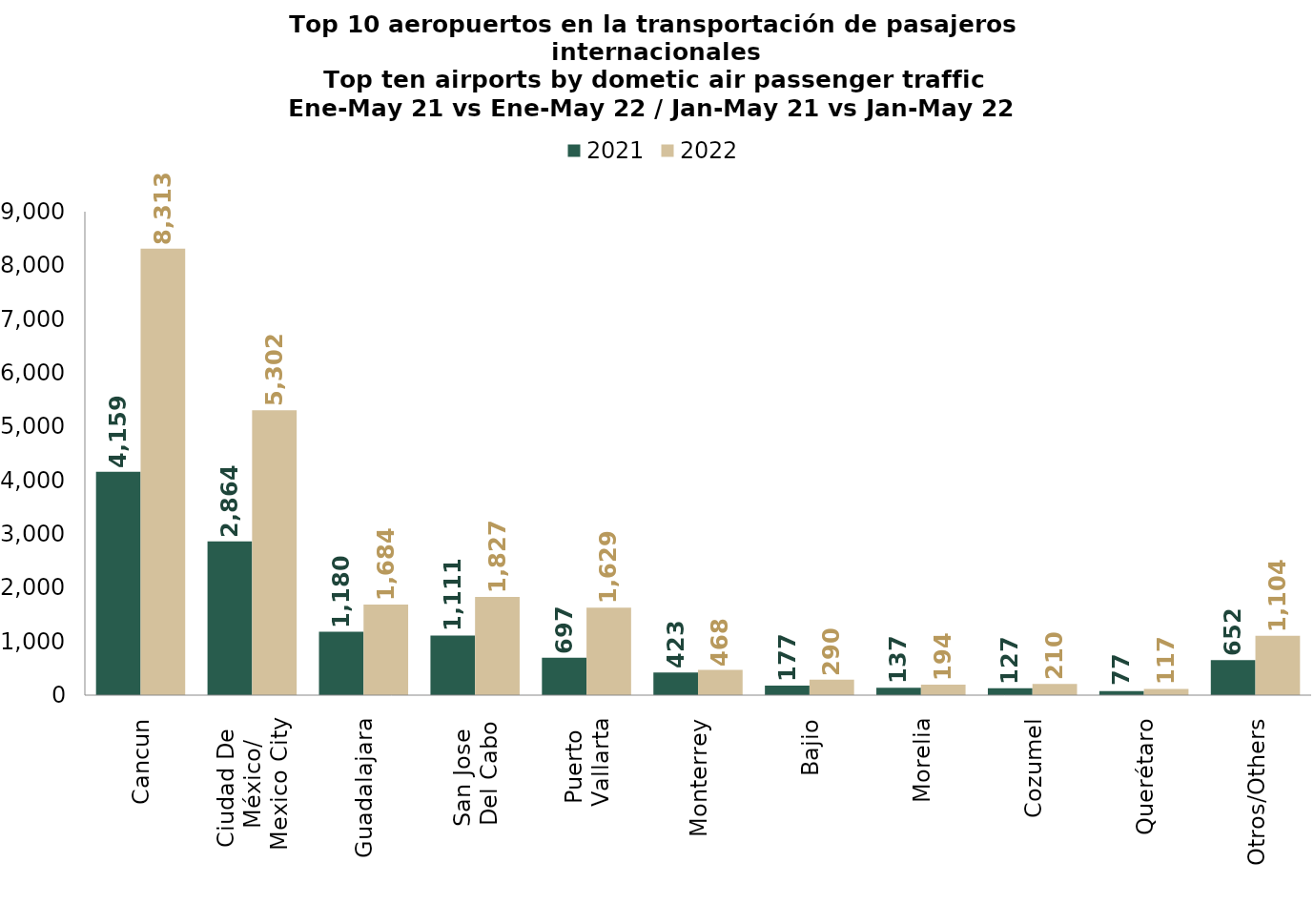
| Category | 2021 | 2022 |
|---|---|---|
| Cancun | 4159.275 | 8313.443 |
| Ciudad De 
México/
Mexico City | 2863.503 | 5302.186 |
| Guadalajara | 1180.413 | 1684.441 |
| San Jose 
Del Cabo | 1110.617 | 1826.653 |
| Puerto 
Vallarta | 697.443 | 1629.215 |
| Monterrey | 423.096 | 468.396 |
| Bajio | 177.023 | 290.056 |
| Morelia | 137.044 | 193.794 |
| Cozumel | 126.938 | 210.469 |
| Querétaro | 76.534 | 117.443 |
| Otros/Others | 652.038 | 1104.148 |